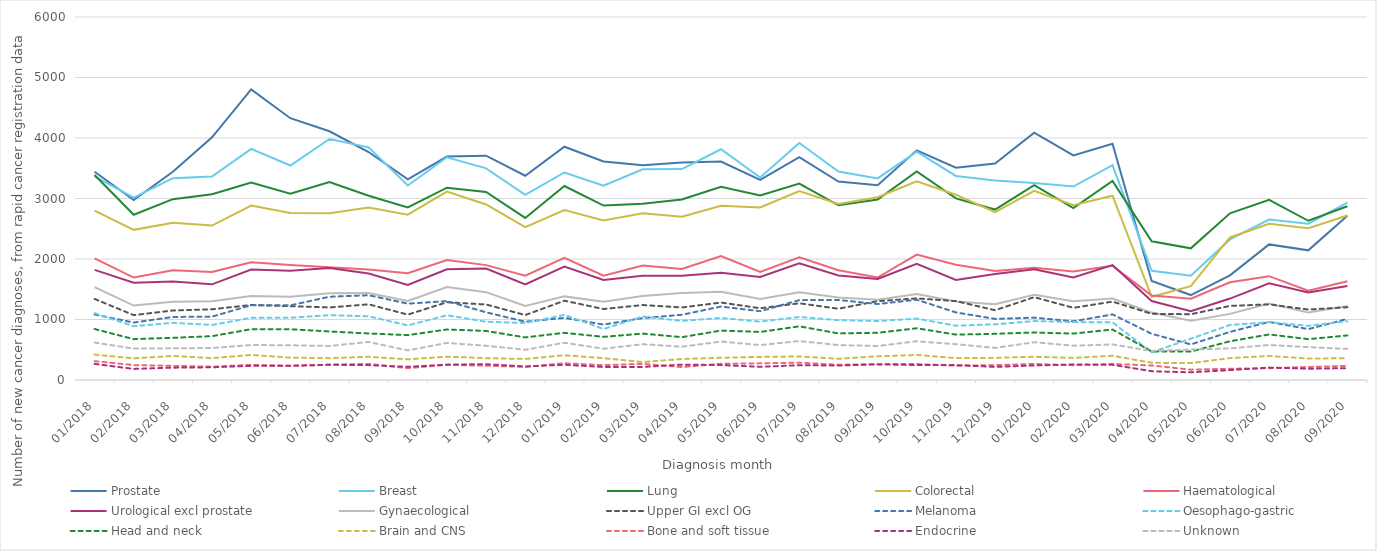
| Category | Prostate | Breast | Lung | Colorectal | Haematological | Urological excl prostate | Gynaecological | Upper GI excl OG | Melanoma | Oesophago-gastric | Head and neck | Brain and CNS | Bone and soft tissue | Endocrine | Unknown |
|---|---|---|---|---|---|---|---|---|---|---|---|---|---|---|---|
| 2018-01-01 | 3442 | 3366 | 3388 | 2799 | 2010 | 1820 | 1534 | 1340 | 1083 | 1105 | 843 | 420 | 311 | 266 | 619 |
| 2018-02-01 | 2975 | 3013 | 2732 | 2482 | 1693 | 1607 | 1230 | 1072 | 950 | 889 | 675 | 358 | 246 | 183 | 519 |
| 2018-03-01 | 3442 | 3336 | 2989 | 2598 | 1815 | 1629 | 1294 | 1149 | 1042 | 945 | 697 | 398 | 234 | 204 | 524 |
| 2018-04-01 | 4012 | 3364 | 3072 | 2552 | 1784 | 1581 | 1300 | 1169 | 1047 | 910 | 725 | 362 | 220 | 210 | 529 |
| 2018-05-01 | 4804 | 3819 | 3263 | 2884 | 1945 | 1825 | 1389 | 1240 | 1236 | 1027 | 840 | 414 | 251 | 234 | 578 |
| 2018-06-01 | 4327 | 3545 | 3078 | 2762 | 1900 | 1807 | 1375 | 1220 | 1234 | 1029 | 839 | 370 | 233 | 236 | 574 |
| 2018-07-01 | 4111 | 3983 | 3273 | 2756 | 1862 | 1851 | 1432 | 1199 | 1376 | 1072 | 802 | 361 | 254 | 252 | 562 |
| 2018-08-01 | 3768 | 3845 | 3045 | 2850 | 1827 | 1761 | 1436 | 1251 | 1401 | 1054 | 769 | 384 | 266 | 246 | 629 |
| 2018-09-01 | 3317 | 3214 | 2852 | 2733 | 1764 | 1570 | 1308 | 1081 | 1262 | 901 | 742 | 342 | 196 | 217 | 489 |
| 2018-10-01 | 3693 | 3682 | 3178 | 3113 | 1982 | 1831 | 1537 | 1285 | 1304 | 1070 | 835 | 386 | 251 | 254 | 613 |
| 2018-11-01 | 3707 | 3498 | 3109 | 2901 | 1899 | 1843 | 1452 | 1248 | 1119 | 963 | 811 | 361 | 236 | 261 | 566 |
| 2018-12-01 | 3376 | 3062 | 2679 | 2528 | 1723 | 1578 | 1224 | 1073 | 964 | 942 | 704 | 348 | 216 | 224 | 500 |
| 2019-01-01 | 3856 | 3430 | 3206 | 2809 | 2019 | 1876 | 1382 | 1311 | 1027 | 1076 | 780 | 409 | 277 | 252 | 615 |
| 2019-02-01 | 3611 | 3212 | 2883 | 2638 | 1725 | 1652 | 1294 | 1173 | 916 | 843 | 713 | 361 | 245 | 215 | 517 |
| 2019-03-01 | 3551 | 3484 | 2913 | 2756 | 1894 | 1724 | 1389 | 1239 | 1023 | 1049 | 767 | 297 | 267 | 216 | 592 |
| 2019-04-01 | 3594 | 3486 | 2983 | 2699 | 1836 | 1725 | 1436 | 1199 | 1078 | 977 | 708 | 347 | 214 | 254 | 550 |
| 2019-05-01 | 3611 | 3814 | 3195 | 2879 | 2049 | 1773 | 1457 | 1280 | 1214 | 1026 | 817 | 367 | 268 | 247 | 636 |
| 2019-06-01 | 3306 | 3348 | 3051 | 2851 | 1786 | 1704 | 1340 | 1186 | 1137 | 965 | 794 | 382 | 275 | 218 | 577 |
| 2019-07-01 | 3682 | 3917 | 3247 | 3124 | 2028 | 1929 | 1452 | 1268 | 1320 | 1042 | 887 | 389 | 286 | 244 | 644 |
| 2019-08-01 | 3279 | 3447 | 2888 | 2909 | 1813 | 1728 | 1363 | 1178 | 1323 | 989 | 770 | 351 | 252 | 240 | 577 |
| 2019-09-01 | 3220 | 3332 | 2983 | 3021 | 1694 | 1669 | 1327 | 1303 | 1256 | 974 | 780 | 392 | 262 | 258 | 562 |
| 2019-10-01 | 3796 | 3775 | 3448 | 3283 | 2074 | 1921 | 1422 | 1349 | 1327 | 1015 | 855 | 414 | 264 | 247 | 640 |
| 2019-11-01 | 3508 | 3373 | 3002 | 3062 | 1905 | 1655 | 1297 | 1304 | 1117 | 898 | 750 | 362 | 236 | 247 | 592 |
| 2019-12-01 | 3578 | 3299 | 2817 | 2775 | 1802 | 1753 | 1253 | 1153 | 1010 | 920 | 763 | 366 | 246 | 217 | 531 |
| 2020-01-01 | 4087 | 3257 | 3219 | 3128 | 1854 | 1831 | 1408 | 1369 | 1031 | 974 | 786 | 384 | 265 | 240 | 624 |
| 2020-02-01 | 3711 | 3198 | 2843 | 2889 | 1794 | 1694 | 1300 | 1193 | 970 | 958 | 767 | 365 | 245 | 256 | 567 |
| 2020-03-01 | 3905 | 3552 | 3290 | 3046 | 1887 | 1899 | 1346 | 1296 | 1084 | 952 | 835 | 401 | 265 | 251 | 588 |
| 2020-04-01 | 1638 | 1804 | 2293 | 1375 | 1397 | 1305 | 1114 | 1094 | 764 | 457 | 472 | 285 | 240 | 145 | 480 |
| 2020-05-01 | 1404 | 1724 | 2176 | 1551 | 1344 | 1138 | 980 | 1087 | 588 | 683 | 470 | 279 | 171 | 127 | 503 |
| 2020-06-01 | 1729 | 2324 | 2755 | 2356 | 1615 | 1346 | 1093 | 1225 | 795 | 910 | 640 | 362 | 186 | 164 | 522 |
| 2020-07-01 | 2241 | 2652 | 2978 | 2582 | 1716 | 1598 | 1264 | 1250 | 960 | 955 | 753 | 397 | 195 | 205 | 579 |
| 2020-08-01 | 2143 | 2584 | 2632 | 2508 | 1476 | 1447 | 1117 | 1165 | 841 | 896 | 675 | 355 | 215 | 187 | 543 |
| 2020-09-01 | 2716 | 2930 | 2871 | 2720 | 1633 | 1552 | 1224 | 1202 | 1010 | 971 | 737 | 360 | 234 | 195 | 514 |